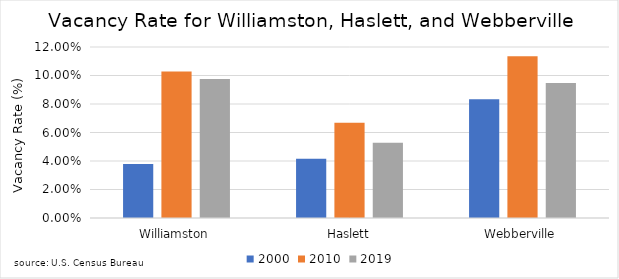
| Category | 2000 | 2010 | 2019 |
|---|---|---|---|
| Williamston | 0.038 | 0.103 | 0.097 |
| Haslett | 0.042 | 0.067 | 0.053 |
| Webberville | 0.083 | 0.113 | 0.095 |